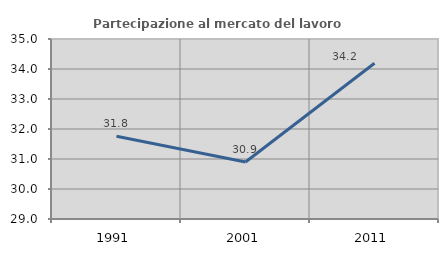
| Category | Partecipazione al mercato del lavoro  femminile |
|---|---|
| 1991.0 | 31.756 |
| 2001.0 | 30.899 |
| 2011.0 | 34.194 |